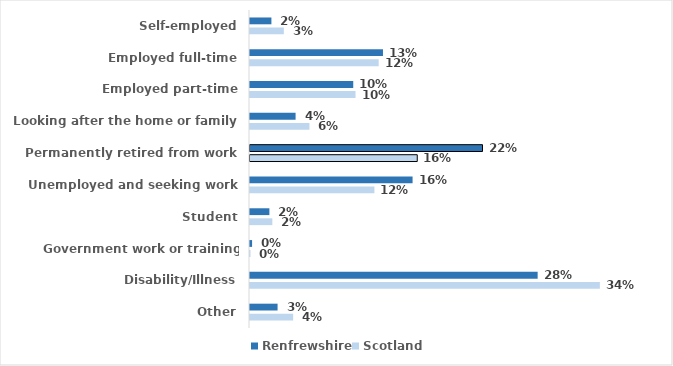
| Category | Renfrewshire | Scotland |
|---|---|---|
| Self-employed | 0.021 | 0.033 |
| Employed full-time | 0.128 | 0.124 |
| Employed part-time | 0.1 | 0.102 |
| Looking after the home or family | 0.044 | 0.057 |
| Permanently retired from work | 0.225 | 0.162 |
| Unemployed and seeking work | 0.157 | 0.12 |
| Student | 0.019 | 0.022 |
| Government work or training scheme | 0.002 | 0 |
| Disability/Illness | 0.278 | 0.338 |
| Other | 0.027 | 0.042 |